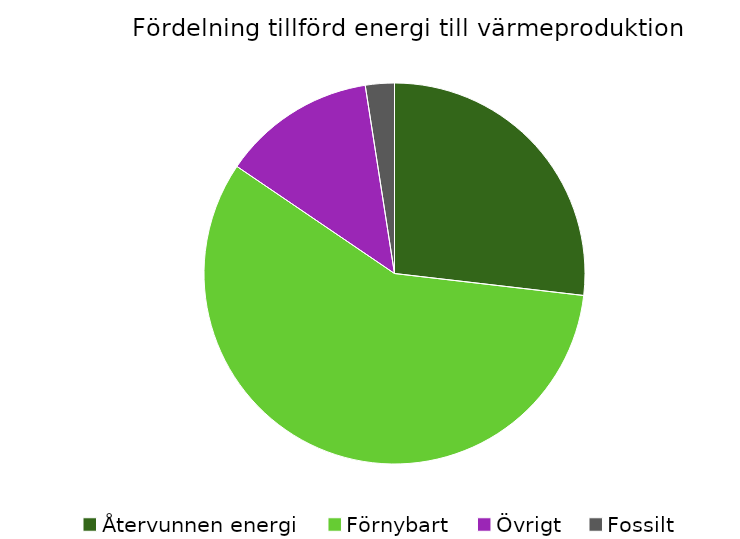
| Category | Fördelning värmeproduktion |
|---|---|
| Återvunnen energi | 0.268 |
| Förnybart | 0.577 |
| Övrigt | 0.13 |
| Fossilt | 0.025 |